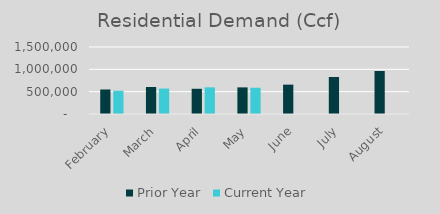
| Category | Prior Year | Current Year |
|---|---|---|
| February | 548904 | 520118 |
| March | 604606 | 569686 |
| April | 564867 | 597404.2 |
| May | 596051 | 588003 |
| June | 657143 | 0 |
| July | 828101 | 0 |
| August | 963307 | 0 |